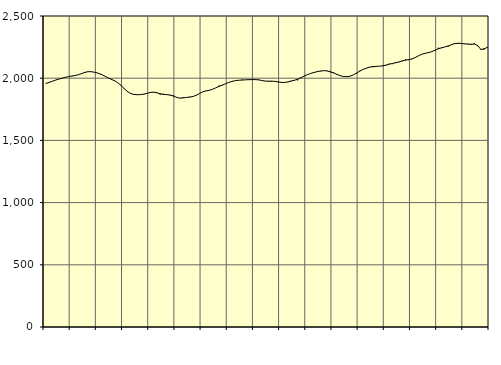
| Category | Piggar | Series 1 |
|---|---|---|
| nan | 1956.9 | 1957.1 |
| 87.0 | 1963.9 | 1965.41 |
| 87.0 | 1975.3 | 1975.08 |
| 87.0 | 1985.8 | 1984.43 |
| nan | 1993.7 | 1992.47 |
| 88.0 | 1998.6 | 1999.97 |
| 88.0 | 2007.5 | 2007.2 |
| 88.0 | 2013.6 | 2013.1 |
| nan | 2015.4 | 2017.48 |
| 89.0 | 2022.2 | 2021.71 |
| 89.0 | 2026.8 | 2027.97 |
| 89.0 | 2035.3 | 2037.21 |
| nan | 2049.3 | 2046.91 |
| 90.0 | 2052.8 | 2052.53 |
| 90.0 | 2050.1 | 2052.09 |
| 90.0 | 2046.7 | 2047.67 |
| nan | 2041.4 | 2040.7 |
| 91.0 | 2034.1 | 2030.71 |
| 91.0 | 2018.6 | 2017.85 |
| 91.0 | 2005.3 | 2004.33 |
| nan | 1990.2 | 1992.17 |
| 92.0 | 1983.5 | 1979.96 |
| 92.0 | 1965 | 1964.46 |
| 92.0 | 1945.3 | 1942.87 |
| nan | 1919.1 | 1916.87 |
| 93.0 | 1888.8 | 1893.07 |
| 93.0 | 1880.1 | 1876.84 |
| 93.0 | 1870.8 | 1869.41 |
| nan | 1864.9 | 1867.21 |
| 94.0 | 1868.6 | 1868.04 |
| 94.0 | 1869 | 1871.86 |
| 94.0 | 1877 | 1878.17 |
| nan | 1882.8 | 1885.21 |
| 95.0 | 1890 | 1887.7 |
| 95.0 | 1884.8 | 1883 |
| 95.0 | 1867.6 | 1875.13 |
| nan | 1874.7 | 1869.52 |
| 96.0 | 1866.1 | 1867.72 |
| 96.0 | 1862.1 | 1864.89 |
| 96.0 | 1861.9 | 1856.57 |
| nan | 1844.7 | 1846.32 |
| 97.0 | 1838.1 | 1840.3 |
| 97.0 | 1847.2 | 1841.64 |
| 97.0 | 1846.3 | 1845.45 |
| nan | 1851.1 | 1847.95 |
| 98.0 | 1849.9 | 1852.63 |
| 98.0 | 1864.5 | 1862.72 |
| 98.0 | 1876.3 | 1876.68 |
| nan | 1889.6 | 1889.98 |
| 99.0 | 1897.3 | 1897.63 |
| 99.0 | 1900.6 | 1902.72 |
| 99.0 | 1910.2 | 1910.74 |
| nan | 1922.5 | 1922.51 |
| 0.0 | 1940.6 | 1934.14 |
| 0.0 | 1941.3 | 1944.64 |
| 0.0 | 1955.5 | 1955.41 |
| nan | 1967.2 | 1966.11 |
| 1.0 | 1971.2 | 1974.86 |
| 1.0 | 1982.1 | 1980.42 |
| 1.0 | 1983.5 | 1983.34 |
| nan | 1988.4 | 1985.11 |
| 2.0 | 1987 | 1986.79 |
| 2.0 | 1990.1 | 1987.93 |
| 2.0 | 1987.2 | 1988.73 |
| nan | 1988.8 | 1988.83 |
| 3.0 | 1989.9 | 1986.88 |
| 3.0 | 1980.4 | 1981.92 |
| 3.0 | 1977.6 | 1977.12 |
| nan | 1972 | 1976.07 |
| 4.0 | 1972.7 | 1976.41 |
| 4.0 | 1976.6 | 1974.63 |
| 4.0 | 1968.4 | 1970.45 |
| nan | 1964.4 | 1966.15 |
| 5.0 | 1968.3 | 1965.6 |
| 5.0 | 1968.3 | 1970.09 |
| 5.0 | 1979.1 | 1976.51 |
| nan | 1984.6 | 1983.05 |
| 6.0 | 1982.7 | 1991.48 |
| 6.0 | 2006.2 | 2003.35 |
| 6.0 | 2016.8 | 2016.94 |
| nan | 2027.6 | 2028.41 |
| 7.0 | 2036.7 | 2038.11 |
| 7.0 | 2042.7 | 2046.11 |
| 7.0 | 2055.8 | 2052.5 |
| nan | 2055.3 | 2057.83 |
| 8.0 | 2060 | 2060.42 |
| 8.0 | 2061.3 | 2058.66 |
| 8.0 | 2047.4 | 2052.05 |
| nan | 2046.4 | 2042.41 |
| 9.0 | 2033.5 | 2031.05 |
| 9.0 | 2020.8 | 2020.75 |
| 9.0 | 2015.1 | 2013.85 |
| nan | 2010.5 | 2012.18 |
| 10.0 | 2017.2 | 2015.9 |
| 10.0 | 2025.4 | 2025.83 |
| 10.0 | 2037.5 | 2040.82 |
| nan | 2059.6 | 2056.83 |
| 11.0 | 2070.9 | 2070.44 |
| 11.0 | 2078.6 | 2081.05 |
| 11.0 | 2090.9 | 2088.65 |
| nan | 2088.4 | 2093.27 |
| 12.0 | 2092.3 | 2095.09 |
| 12.0 | 2096.7 | 2096.19 |
| 12.0 | 2097.5 | 2099.54 |
| nan | 2101.3 | 2105.2 |
| 13.0 | 2117.2 | 2112.38 |
| 13.0 | 2113.2 | 2118.64 |
| 13.0 | 2129.4 | 2123.82 |
| nan | 2128.5 | 2130.87 |
| 14.0 | 2136.7 | 2139 |
| 14.0 | 2154.3 | 2145.27 |
| 14.0 | 2145.2 | 2149.3 |
| nan | 2153.1 | 2155.21 |
| 15.0 | 2164.2 | 2166.66 |
| 15.0 | 2182.5 | 2180.76 |
| 15.0 | 2192.3 | 2192.54 |
| nan | 2199.3 | 2200.54 |
| 16.0 | 2209.3 | 2205.73 |
| 16.0 | 2212 | 2213.25 |
| 16.0 | 2224.8 | 2224.53 |
| nan | 2245.1 | 2236.24 |
| 17.0 | 2241.1 | 2244.77 |
| 17.0 | 2251.8 | 2250.74 |
| 17.0 | 2252.6 | 2258.86 |
| nan | 2266.8 | 2269.33 |
| 18.0 | 2280.5 | 2277.5 |
| 18.0 | 2275.1 | 2280.74 |
| 18.0 | 2282.8 | 2279.51 |
| nan | 2278.6 | 2276.42 |
| 19.0 | 2277.2 | 2273.86 |
| 19.0 | 2267.5 | 2272.92 |
| 19.0 | 2280.8 | 2274.32 |
| nan | 2257.1 | 2263.74 |
| 20.0 | 2228.1 | 2231.5 |
| 20.0 | 2242.1 | 2233.76 |
| 20.0 | 2245.9 | 2249.3 |